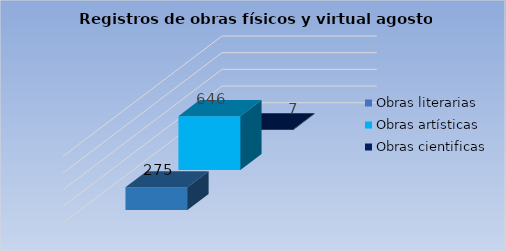
| Category | Obras literarias | Obras artísticas | Obras cientificas |
|---|---|---|---|
| Cantidad | 275 | 646 | 7 |